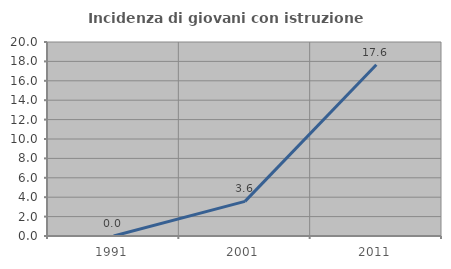
| Category | Incidenza di giovani con istruzione universitaria |
|---|---|
| 1991.0 | 0 |
| 2001.0 | 3.571 |
| 2011.0 | 17.647 |